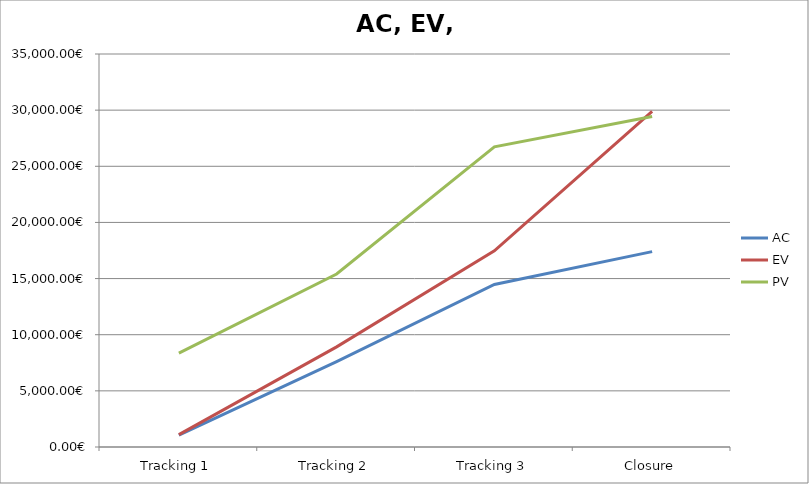
| Category | AC | EV | PV |
|---|---|---|---|
| Tracking 1 | 1050 | 1104 | 8355 |
| Tracking 2 | 7605 | 8919.45 | 15405 |
| Tracking 3 | 14475 | 17464.359 | 26730 |
| Closure | 17400 | 29880 | 29430 |